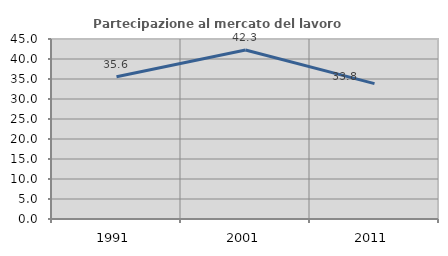
| Category | Partecipazione al mercato del lavoro  femminile |
|---|---|
| 1991.0 | 35.57 |
| 2001.0 | 42.254 |
| 2011.0 | 33.835 |